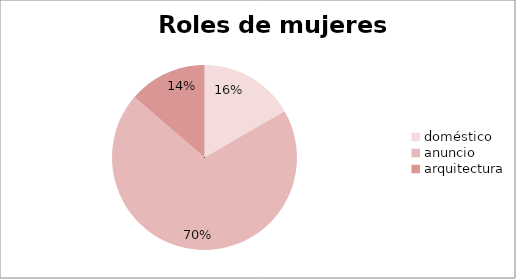
| Category | roles mujeres |
|---|---|
| doméstico | 100 |
| anuncio | 418 |
| arquitectura | 82 |